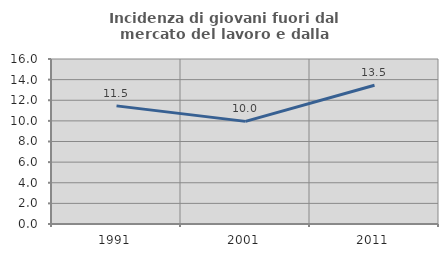
| Category | Incidenza di giovani fuori dal mercato del lavoro e dalla formazione  |
|---|---|
| 1991.0 | 11.454 |
| 2001.0 | 9.952 |
| 2011.0 | 13.457 |